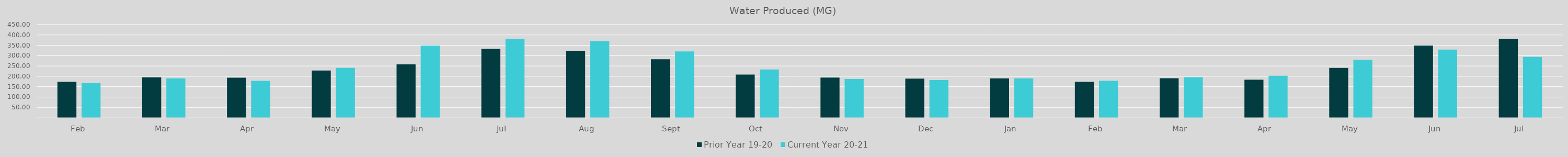
| Category | Prior Year 19-20  | Current Year 20-21 |
|---|---|---|
| Feb | 173.847 | 167.532 |
| Mar | 195.333 | 190.306 |
| Apr | 193.551 | 178.22 |
| May | 228.091 | 240.625 |
| Jun | 257.9 | 348.57 |
| Jul | 333.37 | 381.34 |
| Aug | 323.49 | 370.12 |
| Sep | 282.53 | 320.39 |
| Oct | 208.72 | 233.34 |
| Nov | 193.92 | 187.14 |
| Dec | 188.86 | 182.02 |
| Jan | 189.94 | 189.96 |
| Feb | 173.75 | 178.97 |
| Mar | 190.77 | 195.96 |
| Apr | 184.23 | 203.05 |
| May | 240.63 | 280.19 |
| Jun | 348.57 | 329.038 |
| Jul | 381.336 | 293.585 |